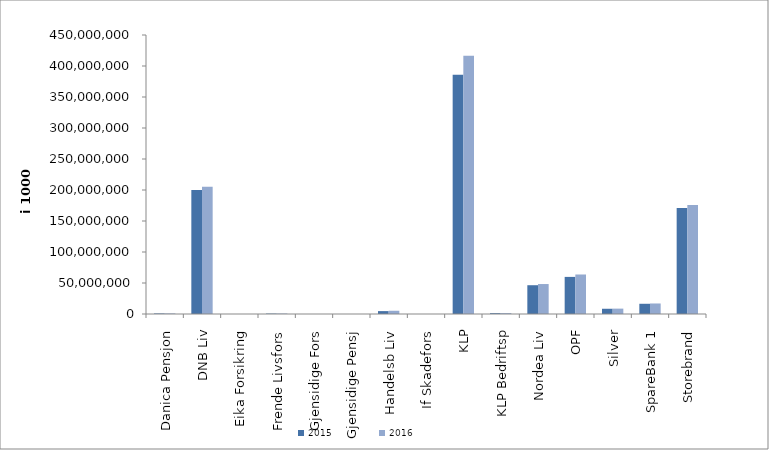
| Category | 2015 | 2016 |
|---|---|---|
| 0 | 883856.729 | 921554.714 |
| 1 | 200020645 | 205209654 |
| 2 | 0 | 0 |
| 3 | 666964 | 738160 |
| 4 | 0 | 0 |
| 5 | 0 | 0 |
| 6 | 4665516.353 | 5218584.771 |
| 7 | 0 | 0 |
| 8 | 385868307.614 | 416576263.684 |
| 9 | 1361441 | 1465104 |
| 10 | 46420604.465 | 48325800.01 |
| 11 | 59844612 | 63722413 |
| 12 | 8449012.33 | 8663691.537 |
| 13 | 16491349.531 | 16959011.262 |
| 14 | 170774219.903 | 175999064.085 |